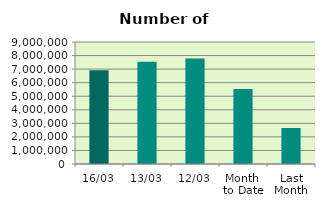
| Category | Series 0 |
|---|---|
| 16/03 | 6920074 |
| 13/03 | 7537882 |
| 12/03 | 7775284 |
| Month 
to Date | 5536511.636 |
| Last
Month | 2656039 |